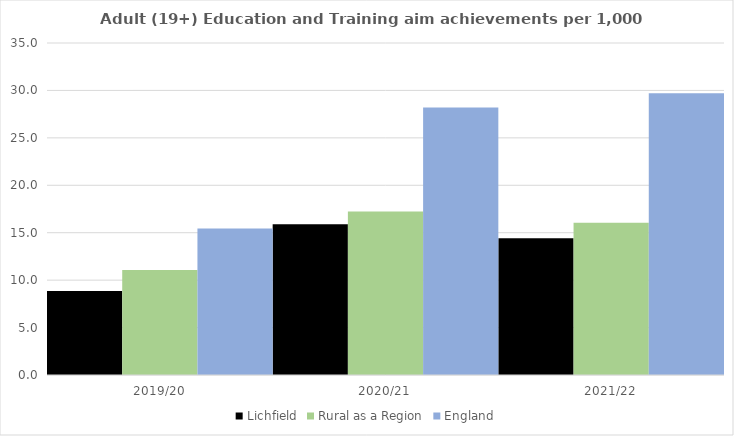
| Category | Lichfield | Rural as a Region | England |
|---|---|---|---|
| 2019/20 | 8.858 | 11.081 | 15.446 |
| 2020/21 | 15.904 | 17.224 | 28.211 |
| 2021/22 | 14.42 | 16.063 | 29.711 |